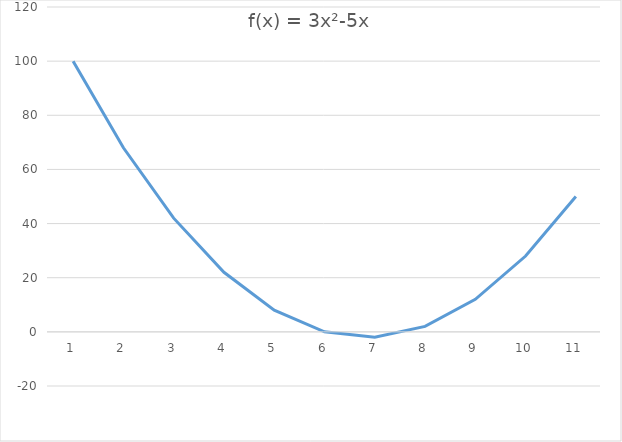
| Category | f(x) = 3x²-5x |
|---|---|
| 0 | 100 |
| 1 | 68 |
| 2 | 42 |
| 3 | 22 |
| 4 | 8 |
| 5 | 0 |
| 6 | -2 |
| 7 | 2 |
| 8 | 12 |
| 9 | 28 |
| 10 | 50 |